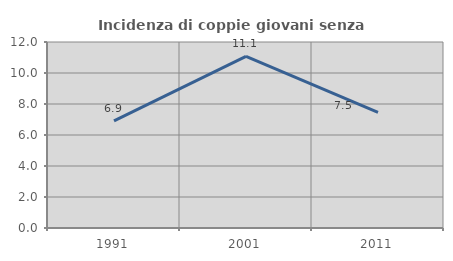
| Category | Incidenza di coppie giovani senza figli |
|---|---|
| 1991.0 | 6.909 |
| 2001.0 | 11.07 |
| 2011.0 | 7.454 |